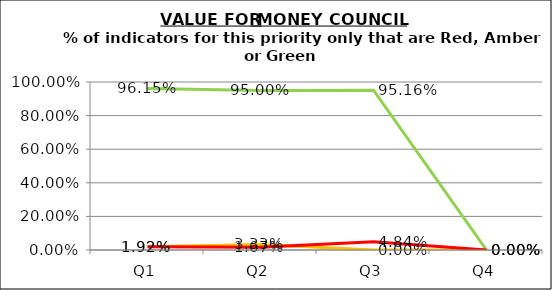
| Category | Green | Amber | Red |
|---|---|---|---|
| Q1 | 0.962 | 0.019 | 0.019 |
| Q2 | 0.95 | 0.033 | 0.017 |
| Q3 | 0.952 | 0 | 0.048 |
| Q4 | 0 | 0 | 0 |